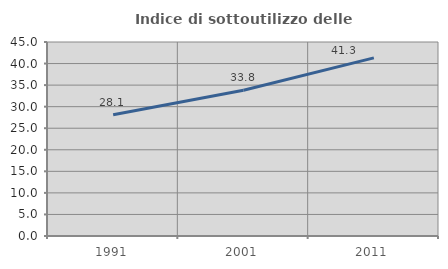
| Category | Indice di sottoutilizzo delle abitazioni  |
|---|---|
| 1991.0 | 28.13 |
| 2001.0 | 33.79 |
| 2011.0 | 41.328 |